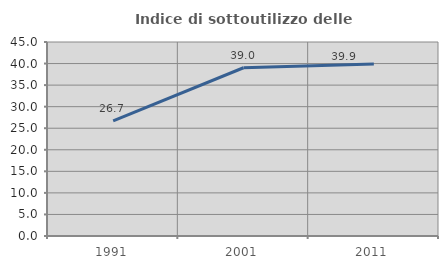
| Category | Indice di sottoutilizzo delle abitazioni  |
|---|---|
| 1991.0 | 26.687 |
| 2001.0 | 39.03 |
| 2011.0 | 39.919 |